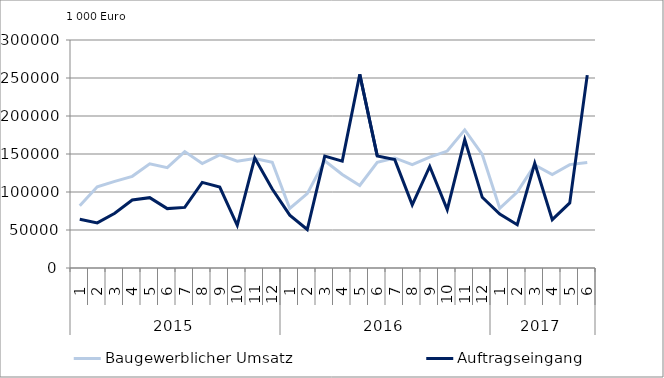
| Category | Baugewerblicher Umsatz | Auftragseingang |
|---|---|---|
| 0 | 81937.361 | 64244.383 |
| 1 | 106908.454 | 59377.677 |
| 2 | 113904.285 | 71953.971 |
| 3 | 120612.446 | 89496.024 |
| 4 | 137142.75 | 92563.213 |
| 5 | 132019.811 | 78131.737 |
| 6 | 153125.961 | 79765.729 |
| 7 | 137370.133 | 112637.987 |
| 8 | 148792.629 | 106572.56 |
| 9 | 140483.911 | 56073.767 |
| 10 | 144146.162 | 144643.688 |
| 11 | 139085.889 | 103931.175 |
| 12 | 78291.738 | 69470.357 |
| 13 | 97863.379 | 50640.033 |
| 14 | 141176.119 | 147206.65 |
| 15 | 123121.297 | 140579.009 |
| 16 | 108561.124 | 254739.334 |
| 17 | 139030.209 | 147481.644 |
| 18 | 144784.416 | 142609.658 |
| 19 | 135870.195 | 83192.156 |
| 20 | 145961.738 | 133594.351 |
| 21 | 153886.826 | 76793.838 |
| 22 | 181740.037 | 168867.568 |
| 23 | 149348.138 | 93011.853 |
| 24 | 78446.78 | 70908.903 |
| 25 | 99841.908 | 56868.408 |
| 26 | 135679.867 | 137790.423 |
| 27 | 123004.403 | 63637.761 |
| 28 | 136010.071 | 85644.63 |
| 29 | 138859.308 | 253791.552 |